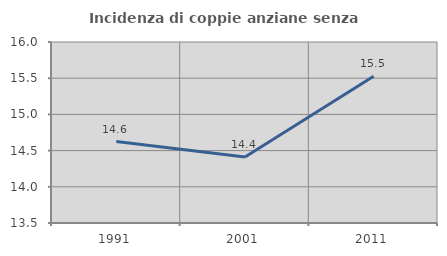
| Category | Incidenza di coppie anziane senza figli  |
|---|---|
| 1991.0 | 14.625 |
| 2001.0 | 14.411 |
| 2011.0 | 15.526 |